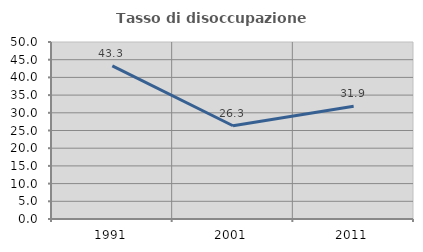
| Category | Tasso di disoccupazione giovanile  |
|---|---|
| 1991.0 | 43.279 |
| 2001.0 | 26.347 |
| 2011.0 | 31.875 |